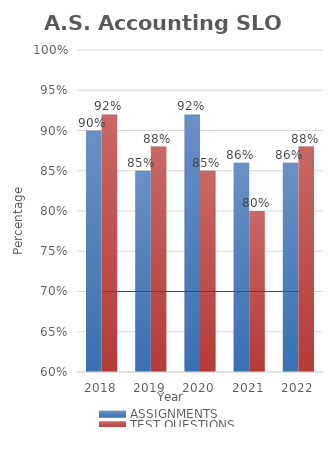
| Category | ASSIGNMENTS | TEST QUESTIONS |
|---|---|---|
| 0 | 0.9 | 0.92 |
| 1 | 0.85 | 0.88 |
| 2 | 0.92 | 0.85 |
| 3 | 0.86 | 0.8 |
| 4 | 0.86 | 0.88 |